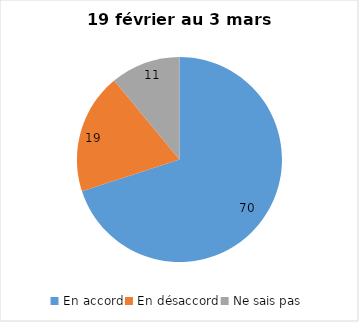
| Category | Series 0 |
|---|---|
| En accord | 70 |
| En désaccord | 19 |
| Ne sais pas | 11 |